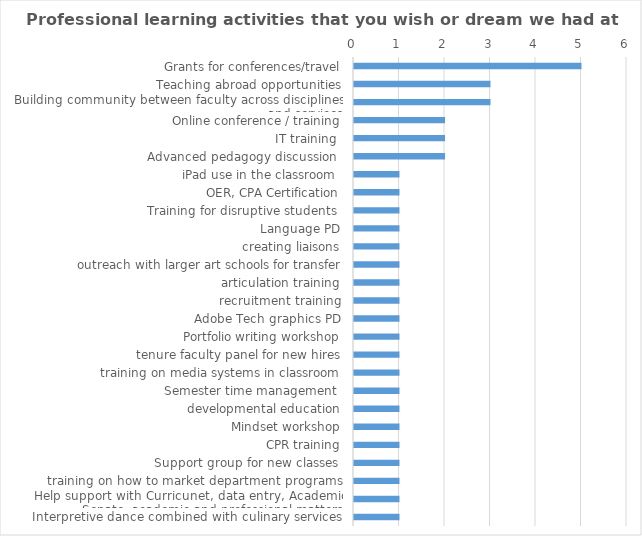
| Category | Series 0 |
|---|---|
| Grants for conferences/travel | 5 |
| Teaching abroad opportunities | 3 |
| Building community between faculty across disciplines and services | 3 |
| Online conference / training | 2 |
| IT training  | 2 |
| Advanced pedagogy discussion  | 2 |
| iPad use in the classroom  | 1 |
| OER, CPA Certification | 1 |
| Training for disruptive students  | 1 |
| Language PD | 1 |
| creating liaisons | 1 |
| outreach with larger art schools for transfer | 1 |
| articulation training | 1 |
| recruitment training | 1 |
| Adobe Tech graphics PD | 1 |
| Portfolio writing workshop | 1 |
| tenure faculty panel for new hires | 1 |
| training on media systems in classroom | 1 |
| Semester time management  | 1 |
| developmental education | 1 |
| Mindset workshop | 1 |
| CPR training | 1 |
| Support group for new classes  | 1 |
| training on how to market department programs | 1 |
| Help support with Curricunet, data entry, Academic Senate, academic and professional matters | 1 |
| Interpretive dance combined with culinary services | 1 |